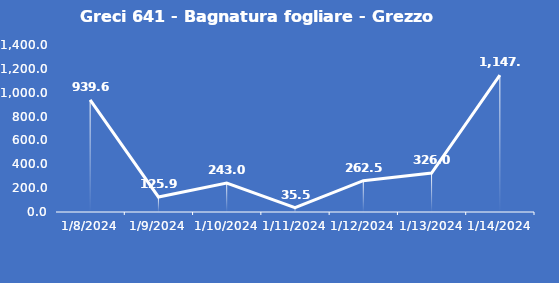
| Category | Greci 641 - Bagnatura fogliare - Grezzo (min) |
|---|---|
| 1/8/24 | 939.6 |
| 1/9/24 | 125.9 |
| 1/10/24 | 243 |
| 1/11/24 | 35.5 |
| 1/12/24 | 262.5 |
| 1/13/24 | 326 |
| 1/14/24 | 1147.7 |